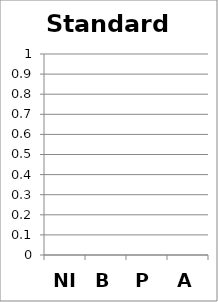
| Category | Standard 2 |
|---|---|
| NI | 0 |
| B | 0 |
| P | 0 |
| A | 0 |